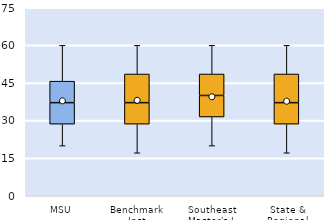
| Category | 25th | 50th | 75th |
|---|---|---|---|
| MSU | 28.571 | 8.571 | 8.571 |
| Benchmark Inst | 28.571 | 8.571 | 11.429 |
| Southeast Master's-L | 31.429 | 8.571 | 8.571 |
| State & Regional | 28.571 | 8.571 | 11.429 |